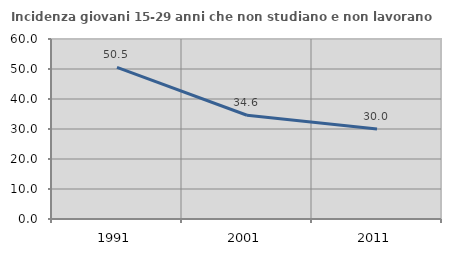
| Category | Incidenza giovani 15-29 anni che non studiano e non lavorano  |
|---|---|
| 1991.0 | 50.525 |
| 2001.0 | 34.58 |
| 2011.0 | 29.993 |